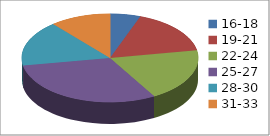
| Category | Series 0 |
|---|---|
| 16-18 | 2 |
| 19-21 | 6 |
| 22-24 | 7 |
| 25-27 | 11 |
| 28-30 | 6 |
| 31-33 | 4 |